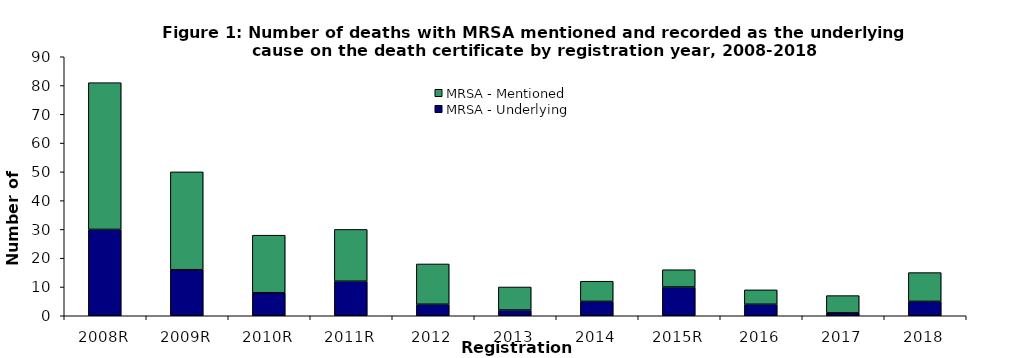
| Category | MRSA - Underlying | MRSA - Mentioned |
|---|---|---|
| 2008R | 30 | 51 |
| 2009R | 16 | 34 |
| 2010R | 8 | 20 |
| 2011R | 12 | 18 |
| 2012 | 4 | 14 |
| 2013 | 2 | 8 |
| 2014 | 5 | 7 |
| 2015R | 10 | 6 |
| 2016 | 4 | 5 |
| 2017 | 1 | 6 |
| 2018 | 5 | 10 |